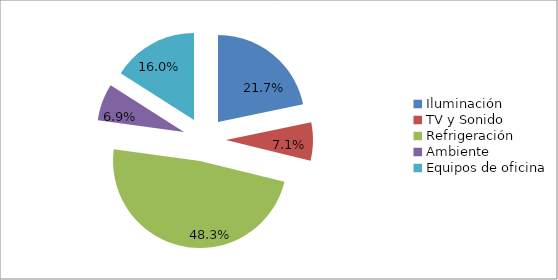
| Category | Series 0 |
|---|---|
| Iluminación  | 0.217 |
| TV y Sonido | 0.071 |
| Refrigeración | 0.483 |
| Ambiente | 0.069 |
| Equipos de oficina | 0.16 |